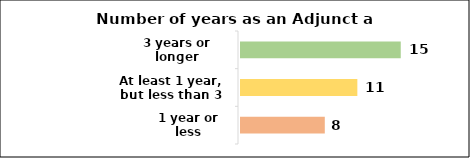
| Category | 8 |
|---|---|
| 1 year or less | 8 |
| At least 1 year, but less than 3 years | 11 |
| 3 years or longer | 15 |